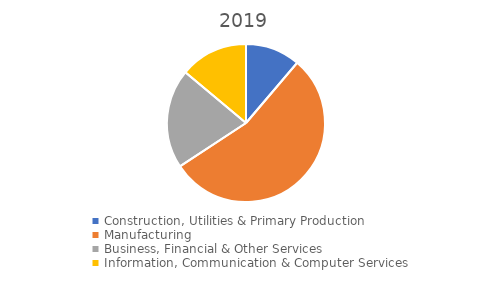
| Category | Series 0 |
|---|---|
| Construction, Utilities & Primary Production  | 0.112 |
| Manufacturing  | 0.545 |
| Business, Financial & Other Services | 0.203 |
| Information, Communication & Computer Services | 0.139 |